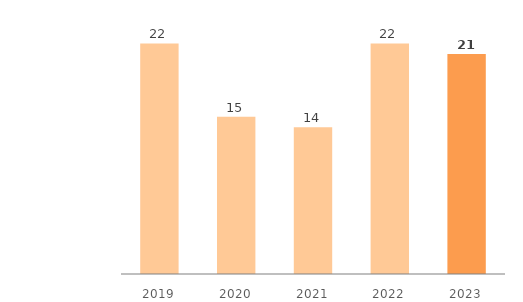
| Category | Assets in Kazakhstan |
|---|---|
| 2019.0 | 22 |
| 2020.0 | 15 |
| 2021.0 | 14 |
| 2022.0 | 22 |
| 2023.0 | 21 |